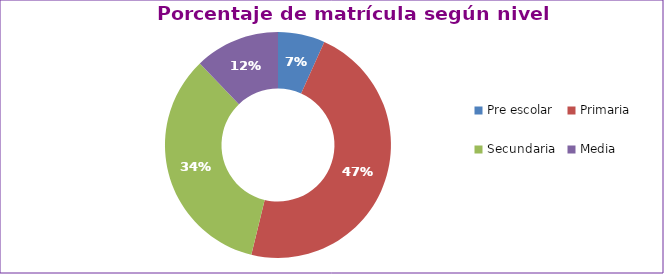
| Category | Series 0 |
|---|---|
| Pre escolar | 0.067 |
| Primaria | 0.471 |
| Secundaria | 0.341 |
| Media | 0.122 |